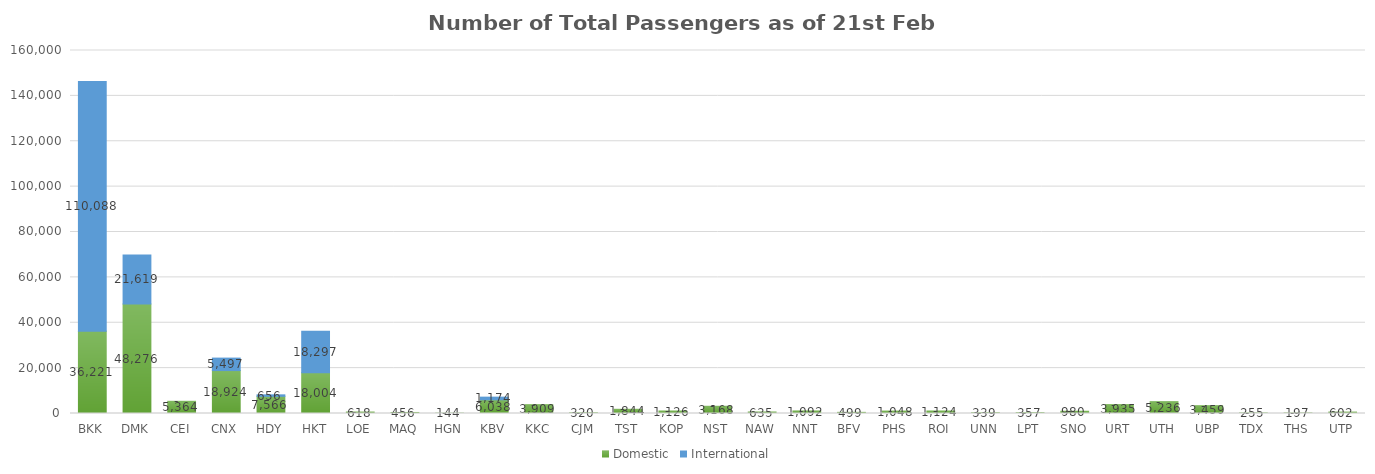
| Category | Domestic | International |
|---|---|---|
| BKK | 36221 | 110088 |
| DMK | 48276 | 21619 |
| CEI | 5364 | 0 |
| CNX | 18924 | 5497 |
| HDY | 7566 | 656 |
| HKT | 18004 | 18297 |
| LOE | 618 | 0 |
| MAQ | 456 | 0 |
| HGN | 144 | 0 |
| KBV | 6038 | 1174 |
| KKC | 3909 | 0 |
| CJM | 320 | 0 |
| TST | 1844 | 0 |
| KOP | 1126 | 0 |
| NST | 3168 | 0 |
| NAW | 635 | 0 |
| NNT | 1092 | 0 |
| BFV | 499 | 0 |
| PHS | 1048 | 0 |
| ROI | 1124 | 0 |
| UNN | 339 | 0 |
| LPT | 357 | 0 |
| SNO | 980 | 0 |
| URT | 3935 | 0 |
| UTH | 5236 | 0 |
| UBP | 3459 | 0 |
| TDX | 255 | 0 |
| THS | 197 | 0 |
| UTP | 602 | 0 |